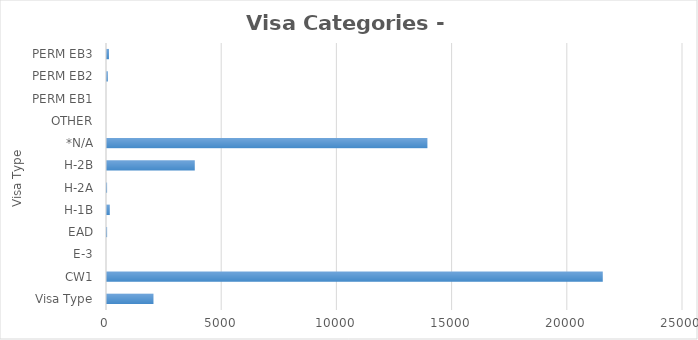
| Category | Series 0 |
|---|---|
| Visa Type | 2017 |
| CW1 | 21518 |
| E-3 | 0 |
| EAD | 5 |
| H-1B | 121 |
| H-2A | 4 |
| H-2B | 3810 |
| *N/A | 13907 |
| OTHER | 0 |
| PERM EB1 | 0 |
| PERM EB2 | 36 |
| PERM EB3 | 85 |